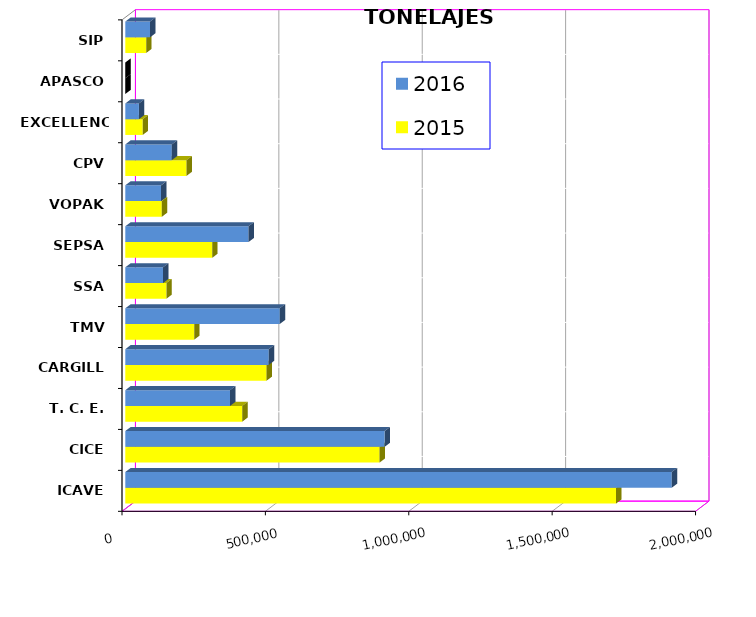
| Category | 2015 | 2016 |
|---|---|---|
| ICAVE | 1711429.219 | 1905505.05 |
| CICE | 886722.198 | 904381.78 |
| T. C. E. | 408028.185 | 365490.155 |
| CARGILL | 492763.6 | 500259.934 |
| TMV | 240101.1 | 538748.034 |
| SSA | 143246.229 | 131874.142 |
| SEPSA | 303125.65 | 429781.964 |
| VOPAK | 127133.279 | 124840.121 |
| CPV | 213495.95 | 162238.966 |
| EXCELLENCE | 60688.94 | 47449.057 |
| APASCO | 0 | 0 |
| SIP | 72725.9 | 86513.89 |